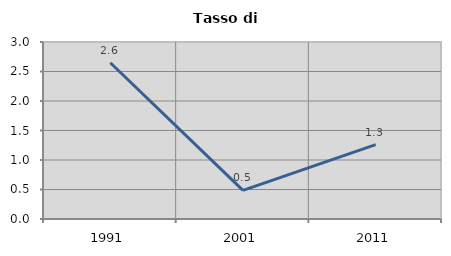
| Category | Tasso di disoccupazione   |
|---|---|
| 1991.0 | 2.648 |
| 2001.0 | 0.484 |
| 2011.0 | 1.259 |